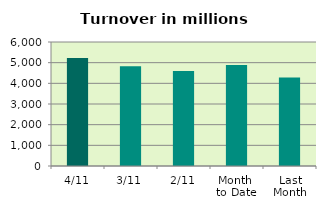
| Category | Series 0 |
|---|---|
| 4/11 | 5227.583 |
| 3/11 | 4821.295 |
| 2/11 | 4601.451 |
| Month 
to Date | 4883.443 |
| Last
Month | 4277.774 |